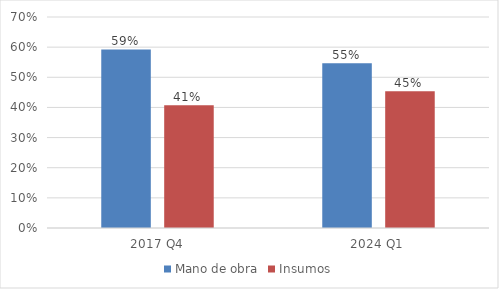
| Category | Mano de obra | Insumos |
|---|---|---|
| 2017 Q4 | 0.593 | 0.407 |
| 2024 Q1 | 0.546 | 0.454 |